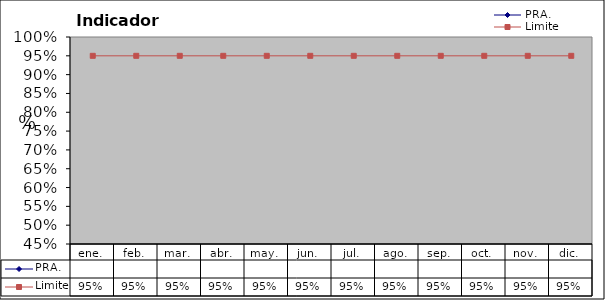
| Category | PRA. | Limite |
|---|---|---|
| ene. |  | 0.95 |
| feb. |  | 0.95 |
| mar. |  | 0.95 |
| abr. |  | 0.95 |
| may. |  | 0.95 |
| jun. |  | 0.95 |
| jul. |  | 0.95 |
| ago. |  | 0.95 |
| sep. |  | 0.95 |
| oct. |  | 0.95 |
| nov. |  | 0.95 |
| dic. |  | 0.95 |